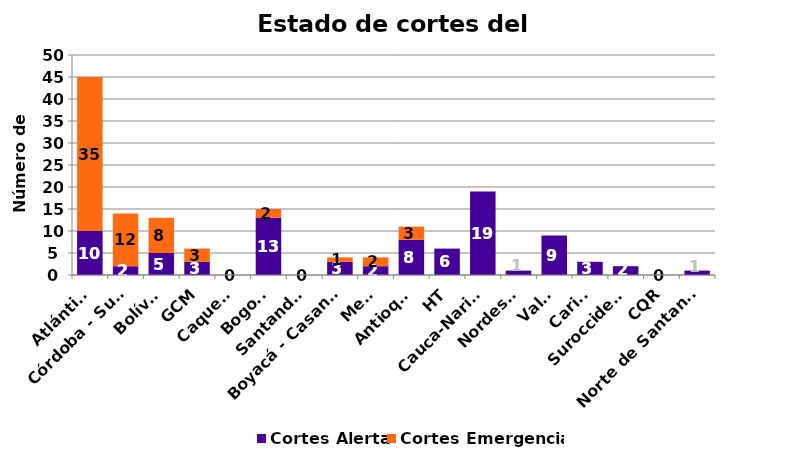
| Category | Cortes Alerta | Cortes Emergencia |
|---|---|---|
| Atlántico | 10 | 35 |
| Córdoba - Sucre | 2 | 12 |
| Bolívar | 5 | 8 |
| GCM | 3 | 3 |
| Caquetá | 0 | 0 |
| Bogotá | 13 | 2 |
| Santander | 0 | 0 |
| Boyacá - Casanare | 3 | 1 |
| Meta | 2 | 2 |
| Antioquia | 8 | 3 |
| HT | 6 | 0 |
| Cauca-Nariño | 19 | 0 |
| Nordeste | 1 | 0 |
| Valle | 9 | 0 |
| Caribe | 3 | 0 |
| Suroccidente | 2 | 0 |
| CQR | 0 | 0 |
| Norte de Santander | 1 | 0 |